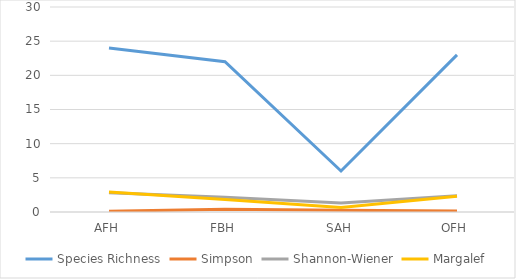
| Category | Species Richness | Simpson | Shannon-Wiener | Margalef |
|---|---|---|---|---|
| AFH | 24 | 0.115 | 2.822 | 2.936 |
| FBH | 22 | 0.387 | 2.153 | 1.836 |
| SAH | 6 | 0.242 | 1.329 | 0.653 |
| OFH | 23 | 0.147 | 2.392 | 2.294 |